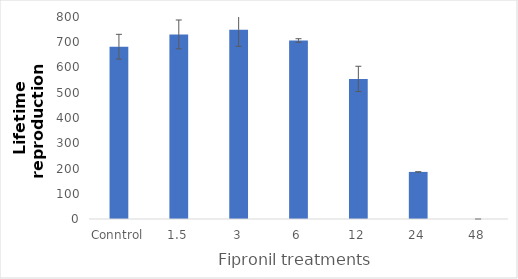
| Category | Series 0 |
|---|---|
| Conntrol | 682.3 |
| 1.5 | 731.067 |
| 3 | 749.667 |
| 6 | 707 |
| 12 | 554.85 |
| 24 | 186.533 |
| 48 | 0 |